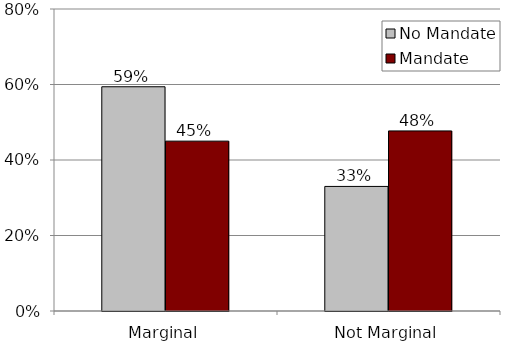
| Category | No Mandate | Mandate |
|---|---|---|
| Marginal | 0.594 | 0.45 |
| Not Marginal | 0.33 | 0.477 |